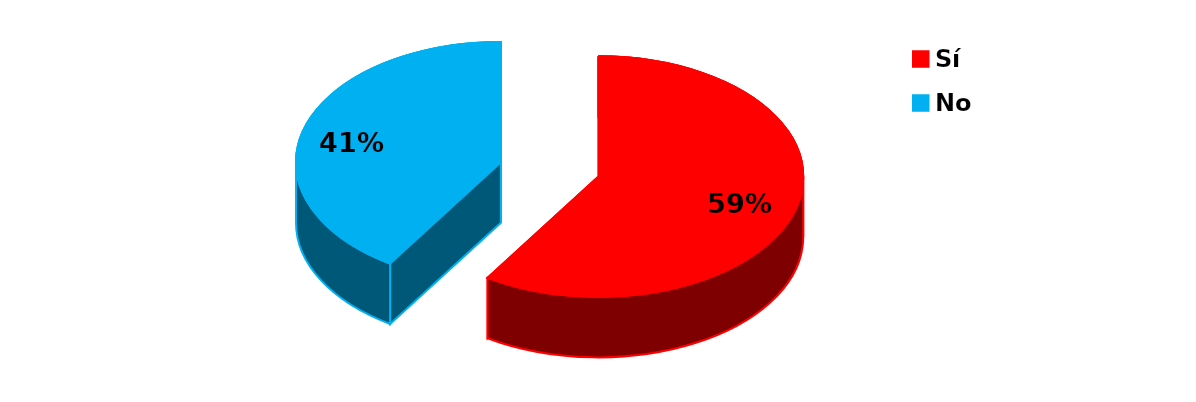
| Category | Series 0 |
|---|---|
| Sí | 26 |
| No | 18 |